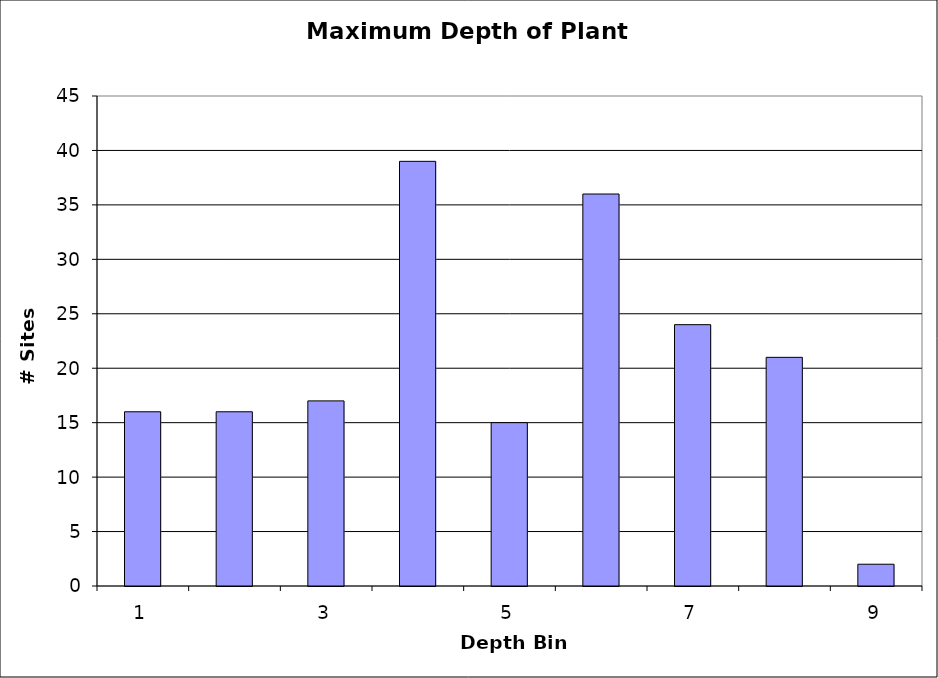
| Category | Series 0 |
|---|---|
| 1.0 | 16 |
| 2.0 | 16 |
| 3.0 | 17 |
| 4.0 | 39 |
| 5.0 | 15 |
| 6.0 | 36 |
| 7.0 | 24 |
| 8.0 | 21 |
| 9.0 | 2 |